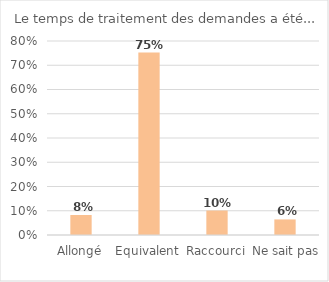
| Category | Series 0 |
|---|---|
| Allongé | 0.083 |
| Equivalent | 0.752 |
| Raccourci | 0.101 |
| Ne sait pas | 0.064 |